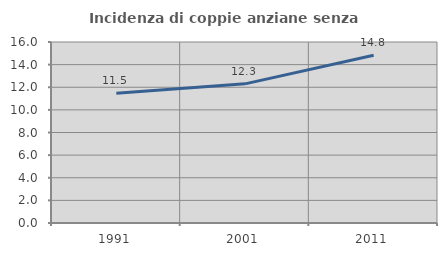
| Category | Incidenza di coppie anziane senza figli  |
|---|---|
| 1991.0 | 11.475 |
| 2001.0 | 12.3 |
| 2011.0 | 14.828 |